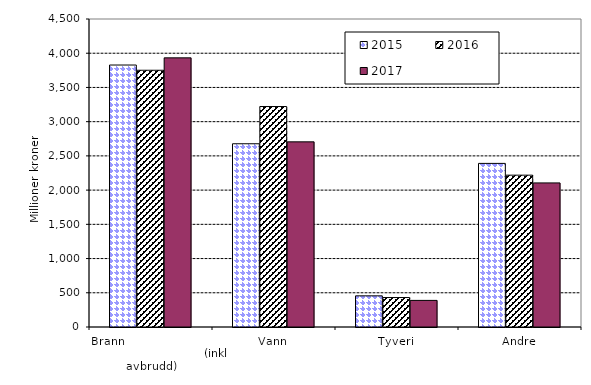
| Category | 2015 | 2016 | 2017 |
|---|---|---|---|
| Brann                                                       (inkl avbrudd) | 3827.682 | 3751.149 | 3932.461 |
| Vann | 2677.196 | 3221.145 | 2705.012 |
| Tyveri | 455.386 | 430.36 | 388.607 |
| Andre | 2390.283 | 2218.392 | 2105.246 |